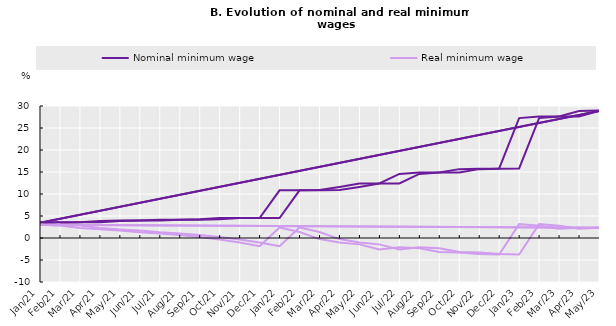
| Category | Nominal minimum wage | Real minimum wage |
|---|---|---|
| 2021-02-01 | 3.446 | 3.009 |
| 2021-03-01 | 3.579 | 2.863 |
| 2021-04-01 | 3.579 | 2.266 |
| 2021-05-01 | 3.849 | 1.961 |
| 2021-06-01 | 3.978 | 1.704 |
| 2021-07-01 | 3.998 | 1.312 |
| 2021-08-01 | 4.148 | 1.044 |
| 2021-09-01 | 4.148 | 0.677 |
| 2021-10-01 | 4.269 | 0.25 |
| 2021-11-01 | 4.543 | -0.346 |
| 2021-12-01 | 4.543 | -1.038 |
| 2022-01-01 | 4.543 | -1.886 |
| 2022-02-01 | 10.832 | 2.408 |
| 2022-03-01 | 10.832 | 1.349 |
| 2022-04-01 | 10.902 | -0.246 |
| 2022-05-01 | 11.602 | -1.032 |
| 2022-06-01 | 12.371 | -1.447 |
| 2022-07-01 | 12.386 | -2.624 |
| 2022-08-01 | 14.553 | -2.097 |
| 2022-09-01 | 14.905 | -2.355 |
| 2022-10-01 | 14.905 | -3.195 |
| 2022-11-01 | 15.651 | -3.31 |
| 2022-12-01 | 15.728 | -3.638 |
| 2023-01-01 | 15.807 | -3.742 |
| 2023-02-01 | 27.251 | 3.153 |
| 2023-03-01 | 27.625 | 2.783 |
| 2023-04-01 | 27.625 | 2.089 |
| 2023-05-01 | 28.869 | 2.324 |
| 2021-01-01 | 3.446 | 3.009 |
| 2021-02-01 | 3.579 | 2.863 |
| 2021-03-01 | 3.579 | 2.266 |
| 2021-04-01 | 3.849 | 1.961 |
| 2021-05-01 | 3.978 | 1.704 |
| 2021-06-01 | 3.998 | 1.312 |
| 2021-07-01 | 4.148 | 1.044 |
| 2021-08-01 | 4.148 | 0.677 |
| 2021-09-01 | 4.269 | 0.25 |
| 2021-10-01 | 4.543 | -0.346 |
| 2021-11-01 | 4.543 | -1.038 |
| 2021-12-01 | 4.543 | -1.886 |
| 2022-01-01 | 10.832 | 2.408 |
| 2022-02-01 | 10.832 | 1.349 |
| 2022-03-01 | 10.902 | -0.246 |
| 2022-04-01 | 11.602 | -1.032 |
| 2022-05-01 | 12.371 | -1.447 |
| 2022-06-01 | 12.386 | -2.624 |
| 2022-07-01 | 14.553 | -2.097 |
| 2022-08-01 | 14.905 | -2.355 |
| 2022-09-01 | 14.905 | -3.195 |
| 2022-10-01 | 15.651 | -3.31 |
| 2022-11-01 | 15.728 | -3.638 |
| 2022-12-01 | 15.807 | -3.742 |
| 2023-01-01 | 27.251 | 3.153 |
| 2023-02-01 | 27.625 | 2.783 |
| 2023-03-01 | 27.625 | 2.089 |
| 2023-04-01 | 28.869 | 2.324 |
| 2023-05-01 | 29.005 | 2.308 |